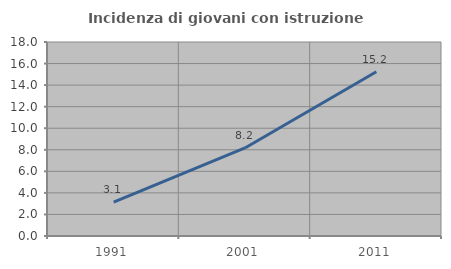
| Category | Incidenza di giovani con istruzione universitaria |
|---|---|
| 1991.0 | 3.15 |
| 2001.0 | 8.167 |
| 2011.0 | 15.238 |